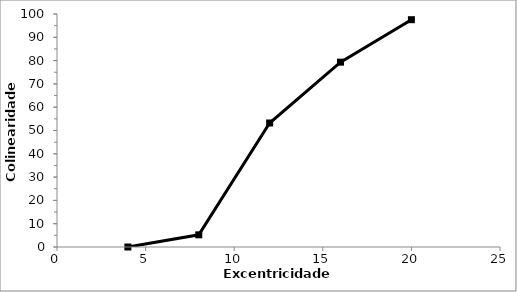
| Category | Series 1 |
|---|---|
| 4.0 | 0 |
| 8.0 | 5.222 |
| 12.0 | 53.222 |
| 16.0 | 79.333 |
| 20.0 | 97.556 |